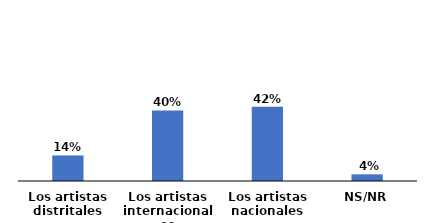
| Category | Series 0 |
|---|---|
| Los artistas distritales | 0.144 |
| Los artistas internacionales | 0.398 |
| Los artistas nacionales | 0.42 |
| NS/NR | 0.038 |